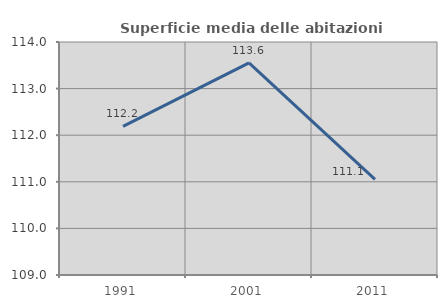
| Category | Superficie media delle abitazioni occupate |
|---|---|
| 1991.0 | 112.189 |
| 2001.0 | 113.553 |
| 2011.0 | 111.053 |